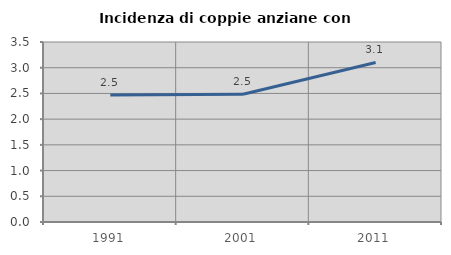
| Category | Incidenza di coppie anziane con figli |
|---|---|
| 1991.0 | 2.471 |
| 2001.0 | 2.484 |
| 2011.0 | 3.102 |